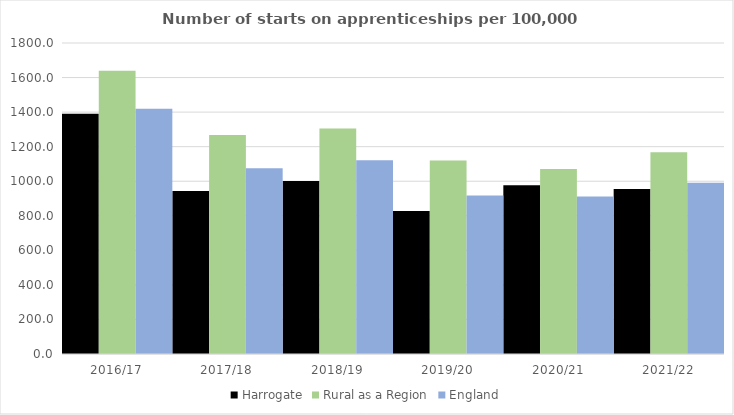
| Category | Harrogate | Rural as a Region | England |
|---|---|---|---|
| 2016/17 | 1391 | 1638.789 | 1420 |
| 2017/18 | 944 | 1267.474 | 1075 |
| 2018/19 | 1001 | 1304.57 | 1122 |
| 2019/20 | 828 | 1119.662 | 918 |
| 2020/21 | 976 | 1070.748 | 912 |
| 2021/22 | 955 | 1167.68 | 991 |